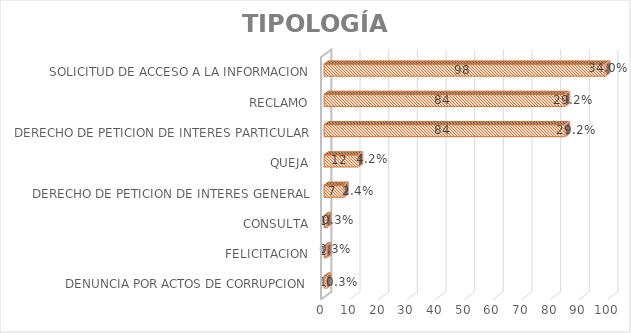
| Category | Cuenta de Número petición | Cuenta de Número petición2 |
|---|---|---|
| DENUNCIA POR ACTOS DE CORRUPCION | 1 | 0.003 |
| FELICITACION | 1 | 0.003 |
| CONSULTA | 1 | 0.003 |
| DERECHO DE PETICION DE INTERES GENERAL | 7 | 0.024 |
| QUEJA | 12 | 0.042 |
| DERECHO DE PETICION DE INTERES PARTICULAR | 84 | 0.292 |
| RECLAMO | 84 | 0.292 |
| SOLICITUD DE ACCESO A LA INFORMACION | 98 | 0.34 |